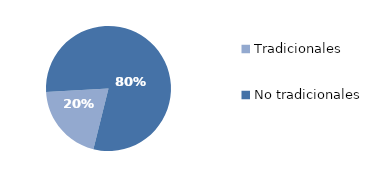
| Category | Series 0 |
|---|---|
| Tradicionales | 240.986 |
| No tradicionales | 950.3 |